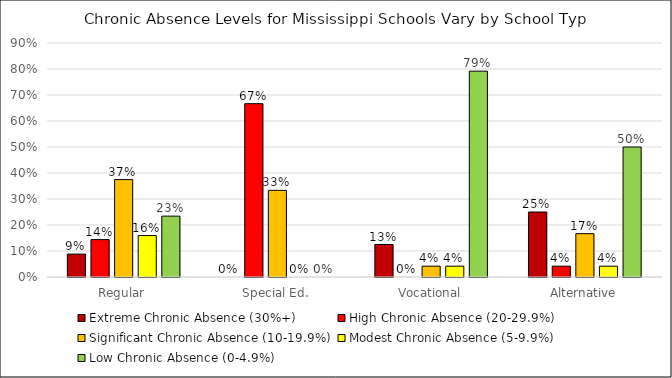
| Category | Extreme Chronic Absence (30%+) | High Chronic Absence (20-29.9%) | Significant Chronic Absence (10-19.9%) | Modest Chronic Absence (5-9.9%) | Low Chronic Absence (0-4.9%) |
|---|---|---|---|---|---|
| Regular | 0.088 | 0.144 | 0.375 | 0.159 | 0.234 |
| Special Ed. | 0 | 0.667 | 0.333 | 0 | 0 |
| Vocational | 0.125 | 0 | 0.042 | 0.042 | 0.792 |
| Alternative | 0.25 | 0.042 | 0.167 | 0.042 | 0.5 |